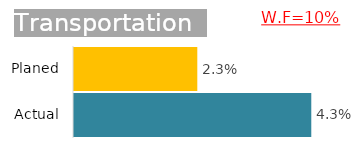
| Category | Transportation  |
|---|---|
| Actual | 0.043 |
| Planed | 0.022 |